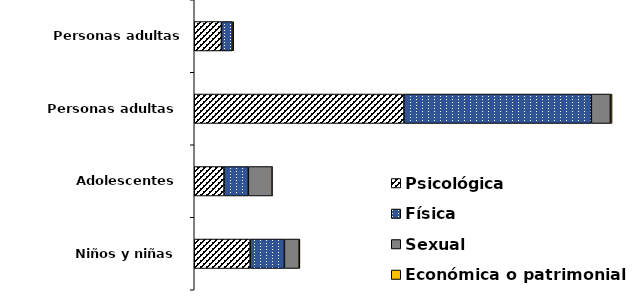
| Category | Psicológica | Física | Sexual | Económica o patrimonial |
|---|---|---|---|---|
| Niños y niñas | 6238 | 3825 | 1637 | 91 |
| Adolescentes | 3326 | 2713 | 2650 | 32 |
| Personas adultas | 23411 | 20909 | 2124 | 187 |
| Personas adultas mayores | 3032 | 1228 | 57 | 70 |